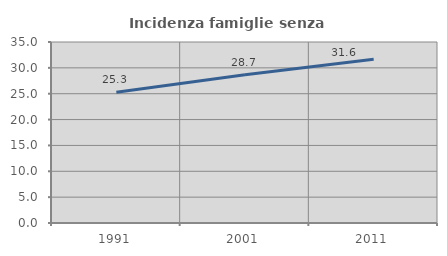
| Category | Incidenza famiglie senza nuclei |
|---|---|
| 1991.0 | 25.275 |
| 2001.0 | 28.689 |
| 2011.0 | 31.65 |